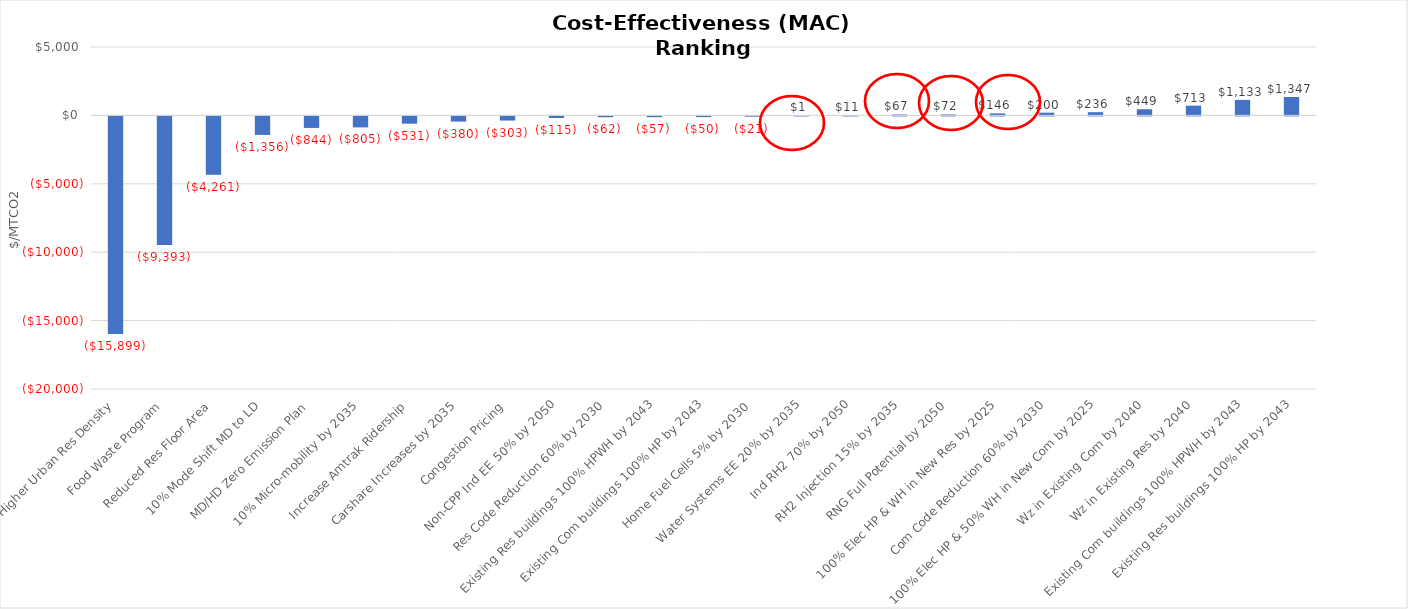
| Category | Series 0 |
|---|---|
| Higher Urban Res Density | -15898.512 |
| Food Waste Program | -9393 |
| Reduced Res Floor Area | -4261.302 |
| 10% Mode Shift MD to LD | -1355.659 |
| MD/HD Zero Emission Plan | -843.946 |
| 10% Micro-mobility by 2035 | -805.235 |
| Increase Amtrak Ridership | -531.414 |
| Carshare Increases by 2035 | -379.573 |
| Congestion Pricing | -303.299 |
| Non-CPP Ind EE 50% by 2050 | -115.311 |
| Res Code Reduction 60% by 2030 | -62.073 |
| Existing Res buildings 100% HPWH by 2043 | -56.81 |
| Existing Com buildings 100% HP by 2043 | -49.928 |
| Home Fuel Cells 5% by 2030 | -20.509 |
| Water Systems EE 20% by 2035 | 0.73 |
| Ind RH2 70% by 2050 | 10.548 |
| RH2 Injection 15% by 2035 | 67.375 |
| RNG Full Potential by 2050 | 71.996 |
| 100% Elec HP & WH in New Res by 2025 | 146.089 |
| Com Code Reduction 60% by 2030 | 200.249 |
| 100% Elec HP & 50% WH in New Com by 2025 | 235.613 |
| Wz in Existing Com by 2040 | 449.313 |
| Wz in Existing Res by 2040 | 712.55 |
| Existing Com buildings 100% HPWH by 2043 | 1132.883 |
| Existing Res buildings 100% HP by 2043 | 1346.851 |